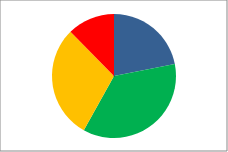
| Category | Series 0 | Series 1 |
|---|---|---|
| Outstanding | 46 | 0.219 |
| Good | 76 | 0.362 |
| RI | 62 | 0.295 |
| Inadequate | 26 | 0.124 |